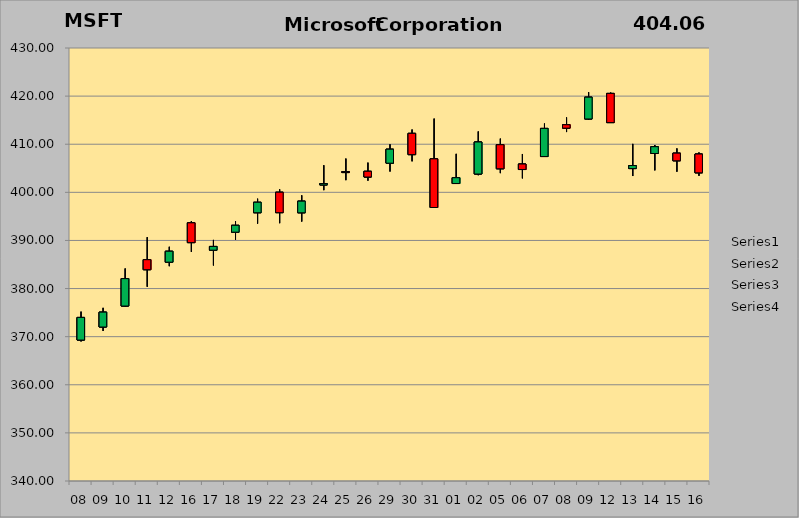
| Category | Series 0 | Series 1 | Series 2 | Series 3 |
|---|---|---|---|---|
| 2024-01-08 | 369.3 | 375.2 | 369.01 | 373.998 |
| 2024-01-09 | 372.01 | 375.99 | 371.19 | 375.096 |
| 2024-01-10 | 376.37 | 384.17 | 376.32 | 382.063 |
| 2024-01-11 | 386 | 390.68 | 380.38 | 383.92 |
| 2024-01-12 | 385.49 | 388.68 | 384.65 | 387.753 |
| 2024-01-16 | 393.66 | 394.03 | 387.62 | 389.55 |
| 2024-01-17 | 387.98 | 390.11 | 384.81 | 388.751 |
| 2024-01-18 | 391.72 | 393.99 | 390.12 | 393.143 |
| 2024-01-19 | 395.76 | 398.67 | 393.5 | 397.934 |
| 2024-01-22 | 400.02 | 400.62 | 393.59 | 395.778 |
| 2024-01-23 | 395.75 | 399.38 | 393.93 | 398.164 |
| 2024-01-24 | 401.54 | 405.63 | 400.45 | 401.817 |
| 2024-01-25 | 404.32 | 407.01 | 402.53 | 404.123 |
| 2024-01-26 | 404.37 | 406.17 | 402.43 | 403.184 |
| 2024-01-29 | 406.06 | 409.98 | 404.33 | 408.964 |
| 2024-01-30 | 412.26 | 413.05 | 406.45 | 407.836 |
| 2024-01-31 | 406.96 | 415.32 | 397.21 | 396.846 |
| 2024-02-01 | 401.83 | 408 | 401.8 | 403.035 |
| 2024-02-02 | 403.81 | 412.65 | 403.56 | 410.461 |
| 2024-02-05 | 409.9 | 411.16 | 403.99 | 404.901 |
| 2024-02-06 | 405.88 | 407.97 | 402.91 | 404.742 |
| 2024-02-07 | 407.44 | 414.3 | 407.4 | 413.286 |
| 2024-02-08 | 414.05 | 415.56 | 412.53 | 413.346 |
| 2024-02-09 | 415.25 | 420.82 | 415.09 | 419.774 |
| 2024-02-12 | 420.56 | 420.74 | 414.75 | 414.494 |
| 2024-02-13 | 404.94 | 410.07 | 403.39 | 405.57 |
| 2024-02-14 | 408.07 | 409.84 | 404.57 | 409.49 |
| 2024-02-15 | 408.14 | 409.13 | 404.29 | 406.56 |
| 2024-02-16 | 407.96 | 408.29 | 403.44 | 404.06 |